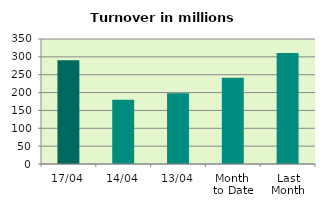
| Category | Series 0 |
|---|---|
| 17/04 | 290.782 |
| 14/04 | 179.8 |
| 13/04 | 197.911 |
| Month 
to Date | 241.274 |
| Last
Month | 310.688 |